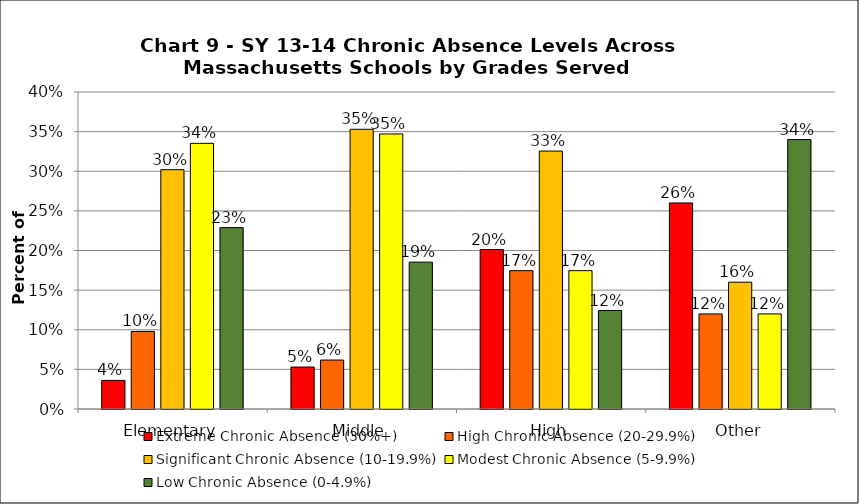
| Category | Extreme Chronic Absence (30%+) | High Chronic Absence (20-29.9%) | Significant Chronic Absence (10-19.9%) | Modest Chronic Absence (5-9.9%) | Low Chronic Absence (0-4.9%) |
|---|---|---|---|---|---|
| 0 | 0.036 | 0.098 | 0.302 | 0.335 | 0.229 |
| 1 | 0.053 | 0.062 | 0.353 | 0.347 | 0.185 |
| 2 | 0.201 | 0.175 | 0.325 | 0.175 | 0.124 |
| 3 | 0.26 | 0.12 | 0.16 | 0.12 | 0.34 |